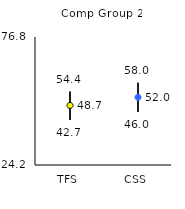
| Category | 25th | 75th | Mean |
|---|---|---|---|
| TFS | 42.7 | 54.4 | 48.67 |
| CSS | 46 | 58 | 52.01 |